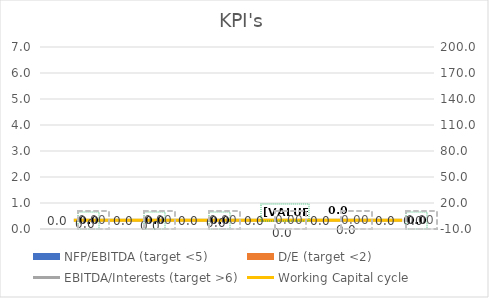
| Category | NFP/EBITDA (target <5) | D/E (target <2) |
|---|---|---|
|  | 0 | 0 |
|  | 0 | 0 |
|  | 0 | 0 |
|  | 0 | 0 |
|  | 0 | 0 |
|  | 0 | 0 |